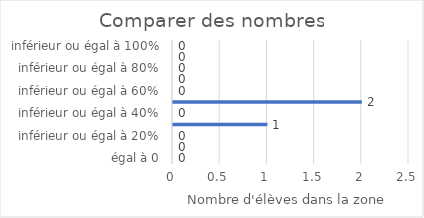
| Category | Comparer des nombres |
|---|---|
| égal à 0 | 0 |
| inférieur ou égal à 10% | 0 |
| inférieur ou égal à 20% | 0 |
| inférieur ou égal à 30% | 1 |
| inférieur ou égal à 40% | 0 |
| inférieur ou égal à 50% | 2 |
| inférieur ou égal à 60% | 0 |
| inférieur ou égal à 70% | 0 |
| inférieur ou égal à 80% | 0 |
| inférieur ou égal à 90% | 0 |
| inférieur ou égal à 100% | 0 |